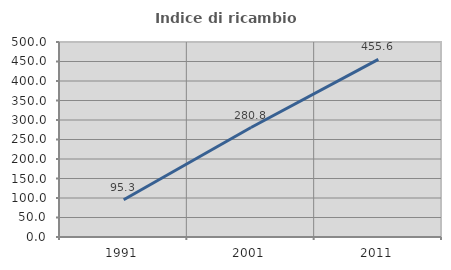
| Category | Indice di ricambio occupazionale  |
|---|---|
| 1991.0 | 95.349 |
| 2001.0 | 280.769 |
| 2011.0 | 455.556 |